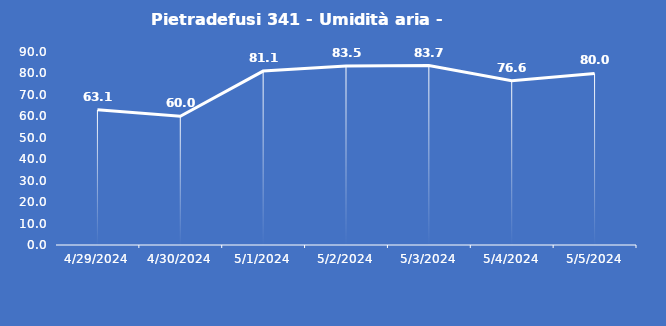
| Category | Pietradefusi 341 - Umidità aria - Grezzo (%) |
|---|---|
| 4/29/24 | 63.1 |
| 4/30/24 | 60 |
| 5/1/24 | 81.1 |
| 5/2/24 | 83.5 |
| 5/3/24 | 83.7 |
| 5/4/24 | 76.6 |
| 5/5/24 | 80 |